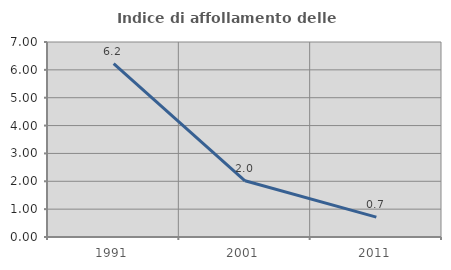
| Category | Indice di affollamento delle abitazioni  |
|---|---|
| 1991.0 | 6.221 |
| 2001.0 | 2.019 |
| 2011.0 | 0.715 |